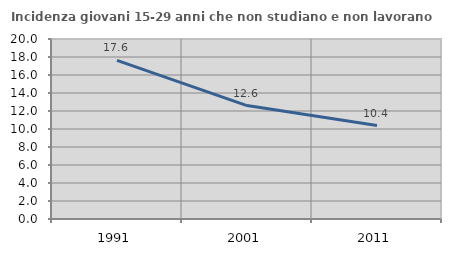
| Category | Incidenza giovani 15-29 anni che non studiano e non lavorano  |
|---|---|
| 1991.0 | 17.624 |
| 2001.0 | 12.601 |
| 2011.0 | 10.381 |